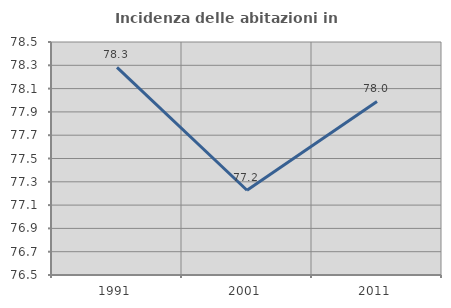
| Category | Incidenza delle abitazioni in proprietà  |
|---|---|
| 1991.0 | 78.282 |
| 2001.0 | 77.228 |
| 2011.0 | 77.99 |